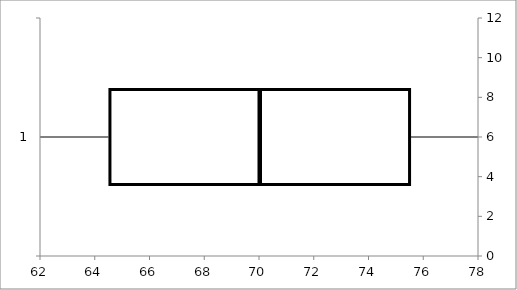
| Category | Q1 | Median | Q3 |
|---|---|---|---|
| 0 | 64.5 | 5.5 | 5.5 |